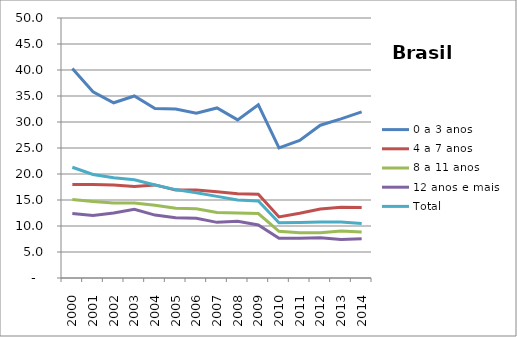
| Category | 0 a 3 anos | 4 a 7 anos | 8 a 11 anos | 12 anos e mais | Total |
|---|---|---|---|---|---|
| 2000.0 | 40.3 | 18 | 15.1 | 12.4 | 21.3 |
| 2001.0 | 35.8 | 18 | 14.7 | 12 | 19.9 |
| 2002.0 | 33.7 | 17.9 | 14.4 | 12.5 | 19.3 |
| 2003.0 | 35 | 17.6 | 14.4 | 13.2 | 18.9 |
| 2004.0 | 32.6 | 17.9 | 14 | 12.1 | 17.9 |
| 2005.0 | 32.5 | 16.9 | 13.4 | 11.6 | 17 |
| 2006.0 | 31.7 | 16.9 | 13.3 | 11.5 | 16.4 |
| 2007.0 | 32.7 | 16.6 | 12.6 | 10.7 | 15.7 |
| 2008.0 | 30.4 | 16.2 | 12.5 | 10.9 | 15 |
| 2009.0 | 33.3 | 16.1 | 12.4 | 10.2 | 14.8 |
| 2010.0 | 25.026 | 11.742 | 8.986 | 7.621 | 10.628 |
| 2011.0 | 26.459 | 12.457 | 8.722 | 7.653 | 10.65 |
| 2012.0 | 29.38 | 13.267 | 8.686 | 7.754 | 10.746 |
| 2013.0 | 30.608 | 13.591 | 9.027 | 7.418 | 10.765 |
| 2014.0 | 31.941 | 13.548 | 8.85 | 7.536 | 10.486 |